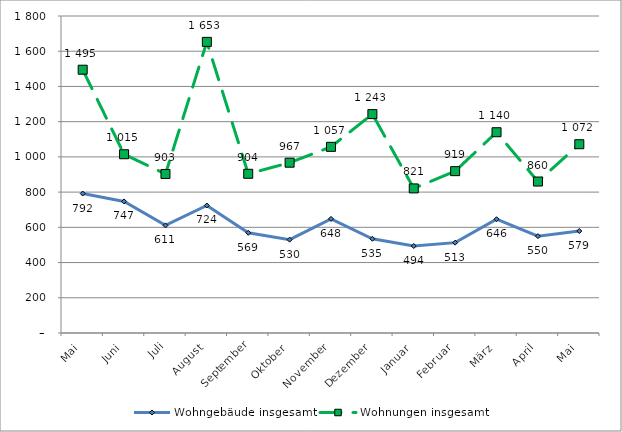
| Category | Wohngebäude insgesamt | Wohnungen insgesamt |
|---|---|---|
| Mai | 792 | 1495 |
| Juni | 747 | 1015 |
| Juli | 611 | 903 |
| August | 724 | 1653 |
| September | 569 | 904 |
| Oktober | 530 | 967 |
| November | 648 | 1057 |
| Dezember | 535 | 1243 |
| Januar | 494 | 821 |
| Februar | 513 | 919 |
| März | 646 | 1140 |
| April | 550 | 860 |
| Mai | 579 | 1072 |